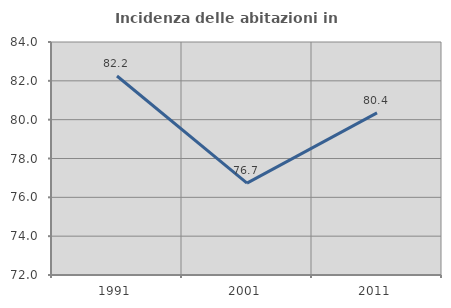
| Category | Incidenza delle abitazioni in proprietà  |
|---|---|
| 1991.0 | 82.249 |
| 2001.0 | 76.73 |
| 2011.0 | 80.351 |